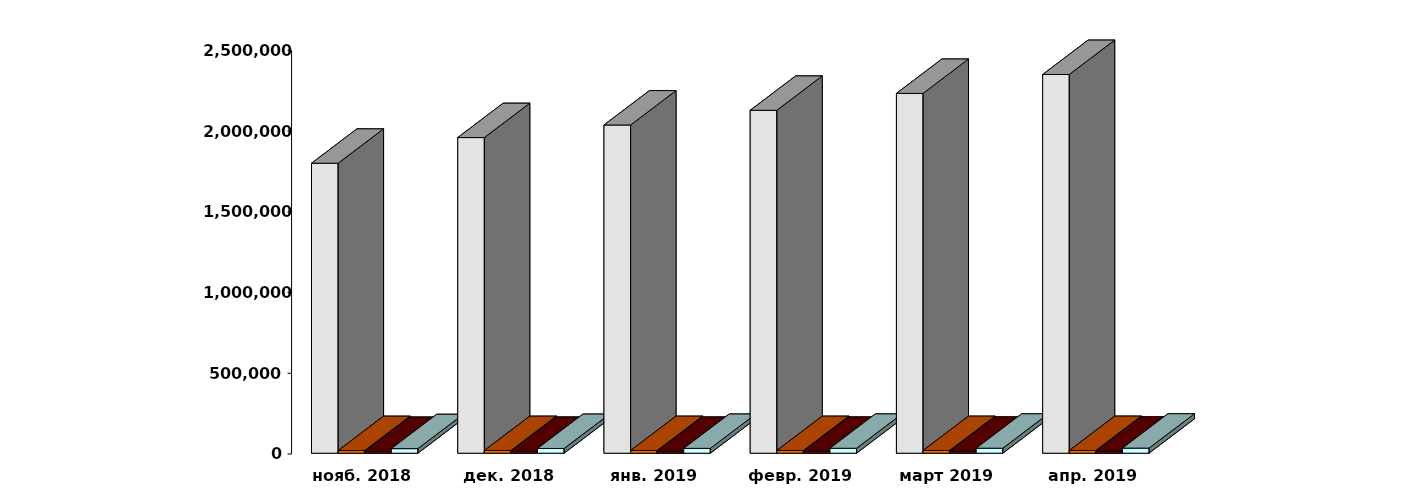
| Category | Физические лица | Юридические лица | Иностранные лица | Клиенты, передавшие свои средства в ДУ |
|---|---|---|---|---|
| 2018-11-28 | 1796071 | 16547 | 11151 | 28275 |
| 2018-12-28 | 1955118 | 16631 | 11453 | 29262 |
| 2019-01-28 | 2032931 | 16590 | 11564 | 29851 |
| 2019-02-28 | 2124042 | 16658 | 11740 | 30559 |
| 2019-03-30 | 2228680 | 16743 | 11947 | 30898 |
| 2019-04-30 | 2345873 | 16794 | 12185 | 31398 |